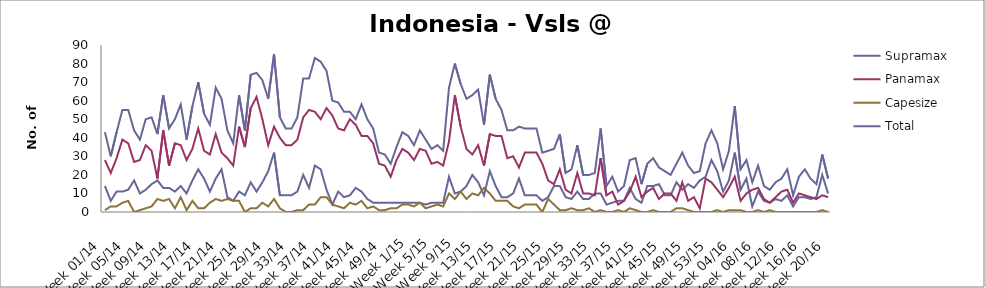
| Category | Supramax | Panamax | Capesize | Total |
|---|---|---|---|---|
| Week 01/14 | 14 | 28 | 1 | 43 |
| Week 02/14 | 6 | 21 | 3 | 30 |
| Week 03/14 | 11 | 29 | 3 | 43 |
| Week 04/14 | 11 | 39 | 5 | 55 |
| Week 05/14 | 12 | 37 | 6 | 55 |
| Week 06/14 | 17 | 27 | 0 | 44 |
| Week 07/14 | 10 | 28 | 1 | 39 |
| Week 08/14 | 12 | 36 | 2 | 50 |
| Week 09/14 | 15 | 33 | 3 | 51 |
| Week 10/14 | 17 | 18 | 7 | 42 |
| Week 11/14 | 13 | 44 | 6 | 63 |
| Week 12/14 | 13 | 25 | 7 | 45 |
| Week 13/14 | 11 | 37 | 2 | 50 |
| Week 14/14 | 14 | 36 | 8 | 58 |
| Week 15/14 | 10 | 28 | 1 | 39 |
| Week 16/14 | 17 | 34 | 6 | 57 |
| Week 17/14 | 23 | 45 | 2 | 70 |
| Week 18/14 | 18 | 33 | 2 | 53 |
| Week 19/14 | 11 | 31 | 5 | 47 |
| Week 20/14 | 18 | 42 | 7 | 67 |
| Week 21/14 | 23 | 32 | 6 | 61 |
| Week 22/14 | 8 | 29 | 7 | 44 |
| Week 23/14 | 6 | 25 | 6 | 37 |
| Week 24/14 | 11 | 46 | 6 | 63 |
| Week 25/14 | 9 | 35 | 0 | 44 |
| Week 26/14 | 16 | 56 | 2 | 74 |
| Week 27/14 | 11 | 62 | 2 | 75 |
| Week 28/14 | 16 | 50 | 5 | 71 |
| Week 29/14 | 22 | 36 | 3 | 61 |
| Week 30/14 | 32 | 46 | 7 | 85 |
| Week 31/14 | 9 | 40 | 2 | 51 |
| Week 32/14 | 9 | 36 | 0 | 45 |
| Week 33/14 | 9 | 36 | 0 | 45 |
| Week 34/14 | 11 | 39 | 1 | 51 |
| Week 35/14 | 20 | 51 | 1 | 72 |
| Week 36/14 | 13 | 55 | 4 | 72 |
| Week 37/14 | 25 | 54 | 4 | 83 |
| Week 38/14 | 23 | 50 | 8 | 81 |
| Week 39/14 | 12 | 56 | 8 | 76 |
| Week 40/14 | 4 | 52 | 4 | 60 |
| Week 41/14 | 11 | 45 | 3 | 59 |
| Week 42/14 | 8 | 44 | 2 | 54 |
| Week 43/14 | 9 | 50 | 5 | 54 |
| Week 44/14 | 13 | 47 | 4 | 50 |
| Week 45/14 | 11 | 41 | 6 | 58 |
| Week 46/14 | 7 | 41 | 2 | 50 |
| Week 47/14 | 5 | 37 | 3 | 45 |
| Week 48/14 | 5 | 26 | 1 | 32 |
| Week 49/14 | 5 | 25 | 1 | 31 |
| Week 50/14 | 5 | 19 | 2 | 26 |
| Week 51/14 | 5 | 28 | 2 | 35 |
| Week 52/14 | 5 | 34 | 4 | 43 |
| Week 1/15 | 5 | 32 | 4 | 41 |
| Week 2/15 | 5 | 28 | 3 | 36 |
| Week 3/15 | 5 | 34 | 5 | 44 |
| Week 4/15 | 4 | 33 | 2 | 39 |
| Week 5/15 | 5 | 26 | 3 | 34 |
| Week 6/15 | 5 | 27 | 4 | 36 |
| Week 7/15 | 5 | 25 | 3 | 33 |
| Week 8/15 | 19 | 38 | 10 | 67 |
| Week 9/15 | 10 | 63 | 7 | 80 |
| Week 10/15 | 11 | 46 | 11 | 69 |
| Week 11/15 | 14 | 34 | 7 | 61 |
| Week 12/15 | 20 | 31 | 10 | 63 |
| Week 13/15 | 16 | 36 | 9 | 66 |
| Week 14/15 | 9 | 25 | 13 | 47 |
| Week 15/15 | 22 | 42 | 10 | 74 |
| Week 16/15 | 14 | 41 | 6 | 61 |
| Week 17/15 | 8 | 41 | 6 | 55 |
| Week 18/15 | 8 | 29 | 6 | 44 |
| Week 19/15 | 10 | 30 | 3 | 44 |
| Week 20/15 | 18 | 24 | 2 | 46 |
| Week 21/15 | 9 | 32 | 4 | 45 |
| Week 22/15 | 9 | 32 | 4 | 45 |
| Week 23/15 | 9 | 32 | 4 | 45 |
| Week 24/15 | 6 | 26 | 0 | 32 |
| Week 25/15 | 8 | 17 | 7 | 33 |
| Week 26/15 | 14 | 15 | 4 | 34 |
| Week 27/15 | 14 | 23 | 1 | 42 |
| Week 28/15 | 8 | 12 | 1 | 21 |
| Week 29/15 | 7 | 10 | 2 | 23 |
| Week 30/15 | 11 | 21 | 1 | 36 |
| Week 31/15 | 7 | 10 | 1 | 20 |
| Week 32/15 | 7 | 10 | 2 | 20 |
| Week 33/15 | 10 | 9 | 0 | 21 |
| Week 34/15 | 10 | 29 | 1 | 45 |
| Week 35/15 | 4 | 9 | 0 | 14 |
| Week 36/15 | 5 | 11 | 0 | 19 |
| Week 37/15 | 6 | 4 | 1 | 11 |
| Week 38/15 | 6 | 6 | 0 | 14 |
| Week 39/15 | 13 | 11 | 2 | 28 |
| Week 40/15 | 7 | 19 | 1 | 29 |
| Week 41/15 | 5 | 8 | 0 | 15 |
| Week 42/15 | 14 | 11 | 0 | 26 |
| Week 43/15 | 14 | 13 | 1 | 29 |
| Week 44/15 | 15 | 7 | 0 | 24 |
| Week 45/15 | 9 | 10 | 0 | 22 |
| Week 46/15 | 9 | 10 | 0 | 20 |
| Week 47/15 | 16 | 6 | 2 | 26 |
| Week 48/15 | 12 | 16 | 2 | 32 |
| Week 49/15 | 15 | 6 | 1 | 25 |
| Week 50/15 | 13 | 8 | 0 | 21 |
| Week 51/15 | 17 | 2 | 0 | 22 |
| Week 52/15 | 19 | 18 | 0 | 37 |
| Week 53/15 | 28 | 16 | 0 | 44 |
| Week 01/16 | 22 | 12 | 1 | 37 |
| Week 02/16 | 11 | 8 | 0 | 23 |
| Week 03/16 | 17 | 13 | 1 | 33 |
| Week 04/16 | 32 | 19 | 1 | 57 |
| Week 05/16 | 12 | 6 | 1 | 23 |
| Week 06/16 | 18 | 10 | 0 | 28 |
| Week 07/16 | 3 | 12 | 0 | 16 |
| Week 08/16 | 11 | 13 | 1 | 25 |
| Week 09/16 | 6 | 7 | 0 | 14 |
| Week 10/16 | 5 | 5 | 1 | 12 |
| Week 11/16 | 7 | 8 | 0 | 16 |
| Week 12/16 | 6 | 11 | 0 | 18 |
| Week 13/16 | 9 | 12 | 0 | 23 |
| Week 14/16 | 3 | 5 | 0 | 9 |
| Week 15/16 | 8 | 10 | 0 | 19 |
| Week 16/16 | 8 | 9 | 0 | 23 |
| Week 17/16 | 7 | 8 | 0 | 18 |
| Week 18/16 | 8 | 7 | 0 | 15 |
| Week 19/16 | 20 | 9 | 1 | 31 |
| Week 20/16 | 10 | 8 | 0 | 18 |